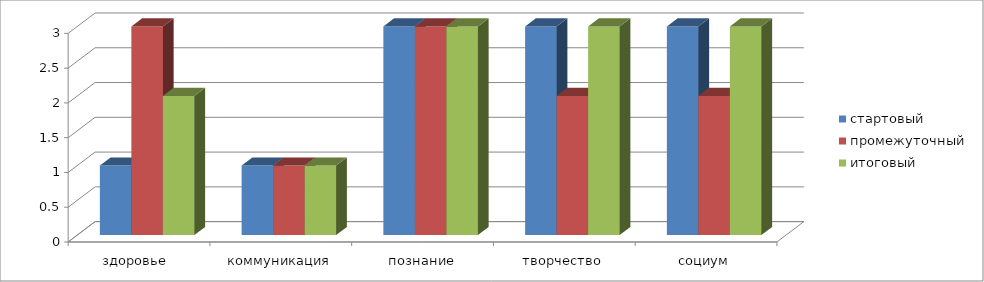
| Category | стартовый | промежуточный | итоговый |
|---|---|---|---|
| здоровье  | 1 | 3 | 2 |
| коммуникация | 1 | 1 | 1 |
| познание | 3 | 3 | 3 |
| творчество | 3 | 2 | 3 |
| социум | 3 | 2 | 3 |